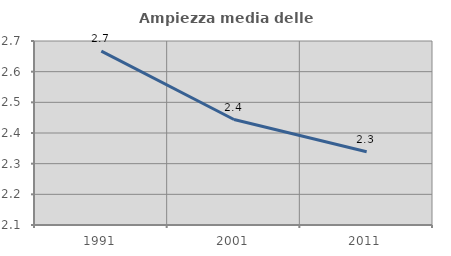
| Category | Ampiezza media delle famiglie |
|---|---|
| 1991.0 | 2.667 |
| 2001.0 | 2.444 |
| 2011.0 | 2.339 |